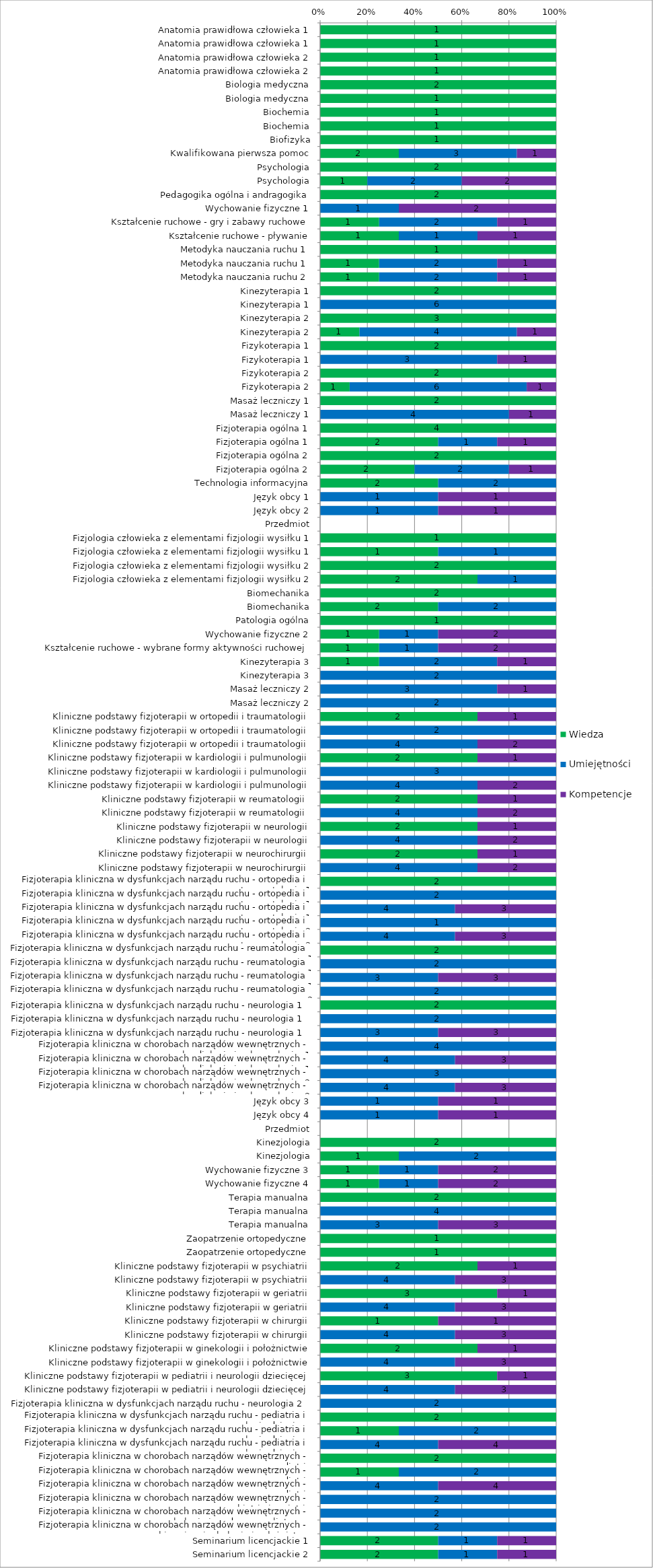
| Category | Wiedza | Umiejętności | Kompetencje |
|---|---|---|---|
| Anatomia prawidłowa człowieka 1 | 1 | 0 | 0 |
| Anatomia prawidłowa człowieka 1 | 1 | 0 | 0 |
| Anatomia prawidłowa człowieka 2 | 1 | 0 | 0 |
| Anatomia prawidłowa człowieka 2 | 1 | 0 | 0 |
| Biologia medyczna | 2 | 0 | 0 |
| Biologia medyczna | 1 | 0 | 0 |
| Biochemia | 1 | 0 | 0 |
| Biochemia | 1 | 0 | 0 |
| Biofizyka | 1 | 0 | 0 |
| Kwalifikowana pierwsza pomoc | 2 | 3 | 1 |
| Psychologia | 2 | 0 | 0 |
| Psychologia | 1 | 2 | 2 |
| Pedagogika ogólna i andragogika | 2 | 0 | 0 |
| Wychowanie fizyczne 1 | 0 | 1 | 2 |
| Kształcenie ruchowe - gry i zabawy ruchowe | 1 | 2 | 1 |
| Kształcenie ruchowe - pływanie | 1 | 1 | 1 |
| Metodyka nauczania ruchu 1 | 1 | 0 | 0 |
| Metodyka nauczania ruchu 1 | 1 | 2 | 1 |
| Metodyka nauczania ruchu 2 | 1 | 2 | 1 |
| Kinezyterapia 1 | 2 | 0 | 0 |
| Kinezyterapia 1 | 0 | 6 | 0 |
| Kinezyterapia 2 | 3 | 0 | 0 |
| Kinezyterapia 2 | 1 | 4 | 1 |
| Fizykoterapia 1 | 2 | 0 | 0 |
| Fizykoterapia 1 | 0 | 3 | 1 |
| Fizykoterapia 2 | 2 | 0 | 0 |
| Fizykoterapia 2 | 1 | 6 | 1 |
| Masaż leczniczy 1 | 2 | 0 | 0 |
| Masaż leczniczy 1 | 0 | 4 | 1 |
| Fizjoterapia ogólna 1 | 4 | 0 | 0 |
| Fizjoterapia ogólna 1 | 2 | 1 | 1 |
| Fizjoterapia ogólna 2 | 2 | 0 | 0 |
| Fizjoterapia ogólna 2 | 2 | 2 | 1 |
| Technologia informacyjna | 2 | 2 | 0 |
| Język obcy 1 | 0 | 1 | 1 |
| Język obcy 2 | 0 | 1 | 1 |
| Przedmiot | 0 | 0 | 0 |
| Fizjologia człowieka z elementami fizjologii wysiłku 1 | 1 | 0 | 0 |
| Fizjologia człowieka z elementami fizjologii wysiłku 1 | 1 | 1 | 0 |
| Fizjologia człowieka z elementami fizjologii wysiłku 2 | 2 | 0 | 0 |
| Fizjologia człowieka z elementami fizjologii wysiłku 2 | 2 | 1 | 0 |
| Biomechanika | 2 | 0 | 0 |
| Biomechanika | 2 | 2 | 0 |
| Patologia ogólna | 1 | 0 | 0 |
| Wychowanie fizyczne 2 | 1 | 1 | 2 |
| Kształcenie ruchowe - wybrane formy aktywności ruchowej | 1 | 1 | 2 |
| Kinezyterapia 3 | 1 | 2 | 1 |
| Kinezyterapia 3 | 0 | 2 | 0 |
| Masaż leczniczy 2 | 0 | 3 | 1 |
| Masaż leczniczy 2 | 0 | 2 | 0 |
| Kliniczne podstawy fizjoterapii w ortopedii i traumatologii | 2 | 0 | 1 |
| Kliniczne podstawy fizjoterapii w ortopedii i traumatologii | 0 | 2 | 0 |
| Kliniczne podstawy fizjoterapii w ortopedii i traumatologii | 0 | 4 | 2 |
| Kliniczne podstawy fizjoterapii w kardiologii i pulmunologii | 2 | 0 | 1 |
| Kliniczne podstawy fizjoterapii w kardiologii i pulmunologii | 0 | 3 | 0 |
| Kliniczne podstawy fizjoterapii w kardiologii i pulmunologii | 0 | 4 | 2 |
| Kliniczne podstawy fizjoterapii w reumatologii  | 2 | 0 | 1 |
| Kliniczne podstawy fizjoterapii w reumatologii  | 0 | 4 | 2 |
| Kliniczne podstawy fizjoterapii w neurologii | 2 | 0 | 1 |
| Kliniczne podstawy fizjoterapii w neurologii | 0 | 4 | 2 |
| Kliniczne podstawy fizjoterapii w neurochirurgii | 2 | 0 | 1 |
| Kliniczne podstawy fizjoterapii w neurochirurgii | 0 | 4 | 2 |
| Fizjoterapia kliniczna w dysfunkcjach narządu ruchu - ortopedia i traumatologia 1 | 2 | 0 | 0 |
| Fizjoterapia kliniczna w dysfunkcjach narządu ruchu - ortopedia i traumatologia 1 | 0 | 2 | 0 |
| Fizjoterapia kliniczna w dysfunkcjach narządu ruchu - ortopedia i traumatologia 1 | 0 | 4 | 3 |
| Fizjoterapia kliniczna w dysfunkcjach narządu ruchu - ortopedia i traumatologia 2 | 0 | 1 | 0 |
| Fizjoterapia kliniczna w dysfunkcjach narządu ruchu - ortopedia i traumatologia 2 | 0 | 4 | 3 |
| Fizjoterapia kliniczna w dysfunkcjach narządu ruchu - reumatologia 1 | 2 | 0 | 0 |
| Fizjoterapia kliniczna w dysfunkcjach narządu ruchu - reumatologia 1 | 0 | 2 | 0 |
| Fizjoterapia kliniczna w dysfunkcjach narządu ruchu - reumatologia 1 | 0 | 3 | 3 |
| Fizjoterapia kliniczna w dysfunkcjach narządu ruchu - reumatologia 2 | 0 | 2 | 0 |
| Fizjoterapia kliniczna w dysfunkcjach narządu ruchu - neurologia 1 | 2 | 0 | 0 |
| Fizjoterapia kliniczna w dysfunkcjach narządu ruchu - neurologia 1 | 0 | 2 | 0 |
| Fizjoterapia kliniczna w dysfunkcjach narządu ruchu - neurologia 1 | 0 | 3 | 3 |
| Fizjoterapia kliniczna w chorobach narządów wewnętrznych - kardiologia i pulmunologia  1 | 0 | 4 | 0 |
| Fizjoterapia kliniczna w chorobach narządów wewnętrznych - kardiologia i pulmunologia  1 | 0 | 4 | 3 |
| Fizjoterapia kliniczna w chorobach narządów wewnętrznych - kardiologia i pulmunologia  2 | 0 | 3 | 0 |
| Fizjoterapia kliniczna w chorobach narządów wewnętrznych - kardiologia i pulmunologia  2 | 0 | 4 | 3 |
| Język obcy 3 | 0 | 1 | 1 |
| Język obcy 4 | 0 | 1 | 1 |
| Przedmiot | 0 | 0 | 0 |
| Kinezjologia | 2 | 0 | 0 |
| Kinezjologia | 1 | 2 | 0 |
| Wychowanie fizyczne 3 | 1 | 1 | 2 |
| Wychowanie fizyczne 4 | 1 | 1 | 2 |
| Terapia manualna | 2 | 0 | 0 |
| Terapia manualna | 0 | 4 | 0 |
| Terapia manualna | 0 | 3 | 3 |
| Zaopatrzenie ortopedyczne | 1 | 0 | 0 |
| Zaopatrzenie ortopedyczne | 1 | 0 | 0 |
| Kliniczne podstawy fizjoterapii w psychiatrii | 2 | 0 | 1 |
| Kliniczne podstawy fizjoterapii w psychiatrii | 0 | 4 | 3 |
| Kliniczne podstawy fizjoterapii w geriatrii | 3 | 0 | 1 |
| Kliniczne podstawy fizjoterapii w geriatrii | 0 | 4 | 3 |
| Kliniczne podstawy fizjoterapii w chirurgii | 1 | 0 | 1 |
| Kliniczne podstawy fizjoterapii w chirurgii | 0 | 4 | 3 |
| Kliniczne podstawy fizjoterapii w ginekologii i położnictwie | 2 | 0 | 1 |
| Kliniczne podstawy fizjoterapii w ginekologii i położnictwie | 0 | 4 | 3 |
| Kliniczne podstawy fizjoterapii w pediatrii i neurologii dziecięcej | 3 | 0 | 1 |
| Kliniczne podstawy fizjoterapii w pediatrii i neurologii dziecięcej | 0 | 4 | 3 |
| Fizjoterapia kliniczna w dysfunkcjach narządu ruchu - neurologia 2 | 0 | 2 | 0 |
| Fizjoterapia kliniczna w dysfunkcjach narządu ruchu - pediatria i neurologia dziecięca | 2 | 0 | 0 |
| Fizjoterapia kliniczna w dysfunkcjach narządu ruchu - pediatria i neurologia dziecięca | 1 | 2 | 0 |
| Fizjoterapia kliniczna w dysfunkcjach narządu ruchu - pediatria i neurologia dziecięca | 0 | 4 | 4 |
| Fizjoterapia kliniczna w chorobach narządów wewnętrznych - pediatria | 2 | 0 | 0 |
| Fizjoterapia kliniczna w chorobach narządów wewnętrznych - pediatria | 1 | 2 | 0 |
| Fizjoterapia kliniczna w chorobach narządów wewnętrznych - pediatria | 0 | 4 | 4 |
| Fizjoterapia kliniczna w chorobach narządów wewnętrznych - psychiatria i geriatria | 0 | 2 | 0 |
| Fizjoterapia kliniczna w chorobach narządów wewnętrznych - onkologia i medycyna paliatywna | 0 | 2 | 0 |
| Fizjoterapia kliniczna w chorobach narządów wewnętrznych - chirurgia, ginekologia i położnictwo | 0 | 2 | 0 |
| Seminarium licencjackie 1 | 2 | 1 | 1 |
| Seminarium licencjackie 2 | 2 | 1 | 1 |